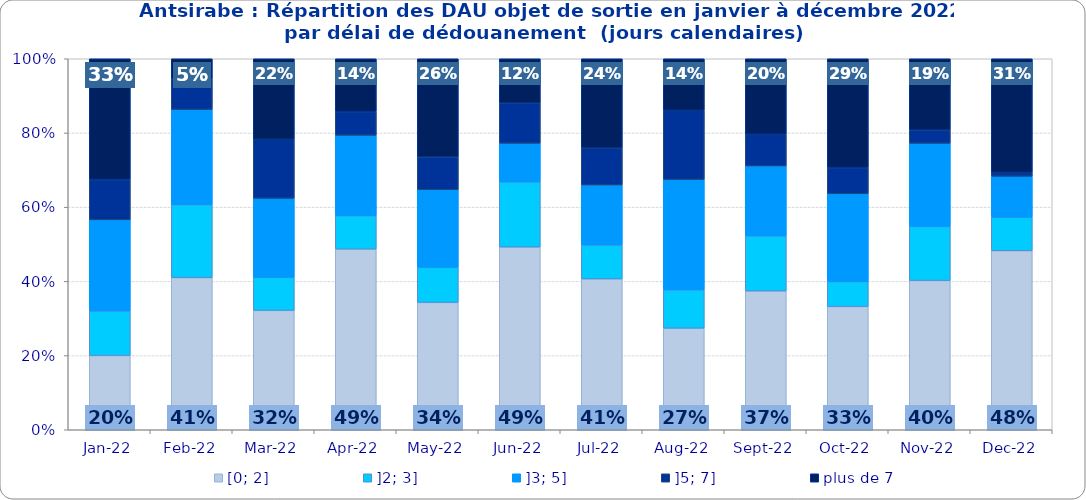
| Category | [0; 2] | ]2; 3] | ]3; 5] | ]5; 7] | plus de 7 |
|---|---|---|---|---|---|
| 2022-01-01 | 0.2 | 0.12 | 0.246 | 0.109 | 0.326 |
| 2022-02-01 | 0.41 | 0.197 | 0.257 | 0.082 | 0.055 |
| 2022-03-01 | 0.322 | 0.089 | 0.213 | 0.159 | 0.217 |
| 2022-04-01 | 0.487 | 0.09 | 0.217 | 0.064 | 0.142 |
| 2022-05-01 | 0.343 | 0.095 | 0.209 | 0.088 | 0.265 |
| 2022-06-01 | 0.493 | 0.175 | 0.104 | 0.108 | 0.119 |
| 2022-07-01 | 0.407 | 0.091 | 0.162 | 0.1 | 0.241 |
| 2022-08-01 | 0.274 | 0.103 | 0.298 | 0.187 | 0.139 |
| 2022-09-01 | 0.374 | 0.148 | 0.189 | 0.085 | 0.204 |
| 2022-10-01 | 0.332 | 0.067 | 0.237 | 0.071 | 0.293 |
| 2022-11-01 | 0.402 | 0.146 | 0.224 | 0.036 | 0.192 |
| 2022-12-01 | 0.482 | 0.09 | 0.111 | 0.01 | 0.307 |